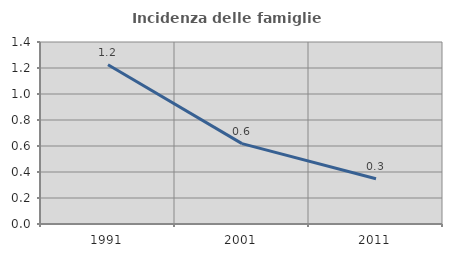
| Category | Incidenza delle famiglie numerose |
|---|---|
| 1991.0 | 1.225 |
| 2001.0 | 0.618 |
| 2011.0 | 0.348 |